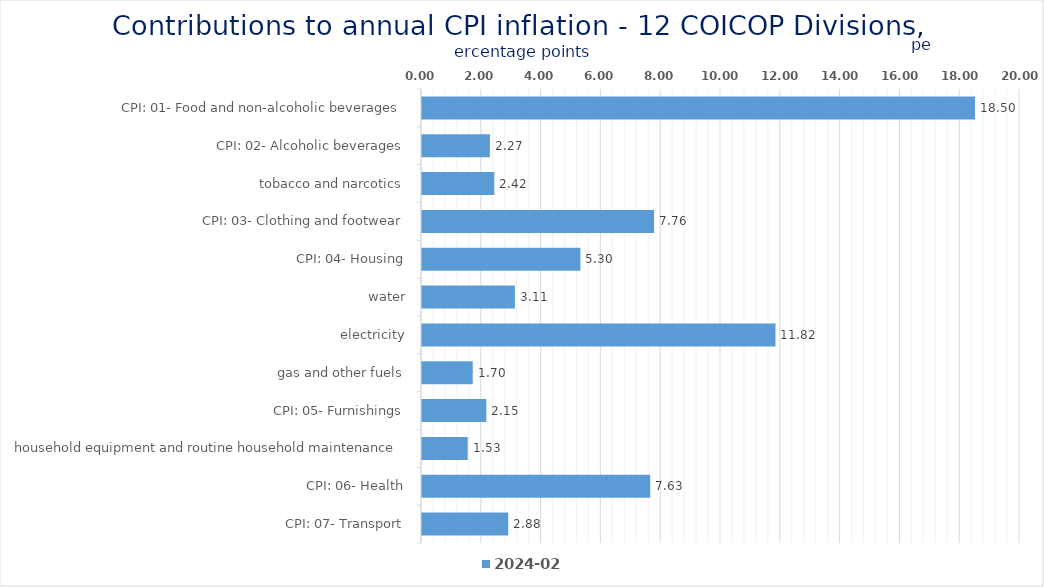
| Category | 2024-02 |
|---|---|
| CPI: 01- Food and non-alcoholic beverages | 18.495 |
| CPI: 02- Alcoholic beverages, tobacco and narcotics | 2.271 |
| CPI: 03- Clothing and footwear | 2.418 |
| CPI: 04- Housing, water, electricity, gas and other fuels | 7.761 |
| CPI: 05- Furnishings, household equipment and routine household maintenance | 5.298 |
| CPI: 06- Health | 3.108 |
| CPI: 07- Transport | 11.822 |
| CPI: 08- Communication | 1.698 |
| CPI: 09- Recreation and culture | 2.152 |
| CPI: 10- Education | 1.529 |
| CPI: 11- Restaurants and hotels | 7.633 |
| CPI: 12- Miscellaneous goods and services | 2.885 |